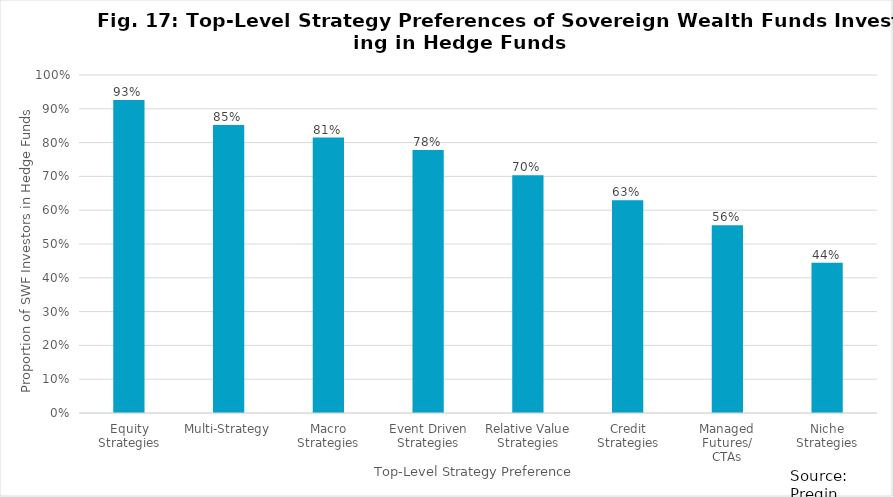
| Category | Series 0 |
|---|---|
| Equity Strategies | 0.926 |
| Multi-Strategy | 0.852 |
| Macro Strategies | 0.815 |
| Event Driven
Strategies | 0.778 |
| Relative Value
Strategies | 0.704 |
| Credit Strategies | 0.63 |
| Managed Futures/
CTAs | 0.556 |
| Niche Strategies | 0.444 |